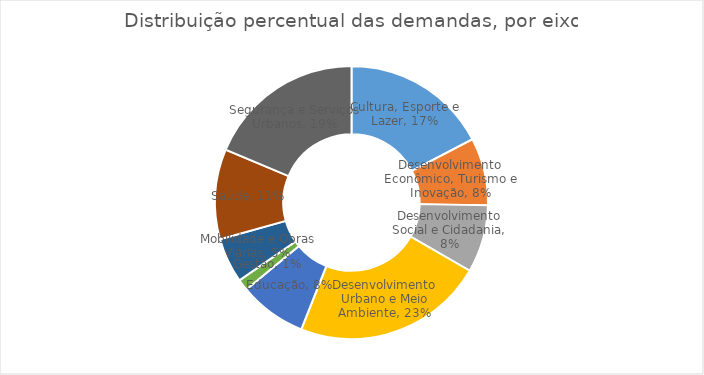
| Category | Contagem |
|---|---|
| Cultura, Esporte e Lazer | 13 |
| Desenvolvimento Econômico, Turismo e Inovação | 6 |
| Desenvolvimento Social e Cidadania | 6 |
| Desenvolvimento Urbano e Meio Ambiente | 17 |
| Educação | 6 |
| Gestão | 1 |
| Mobilidade e Obras Viárias | 4 |
| Saúde | 8 |
| Segurança e Serviços Urbanos | 14 |